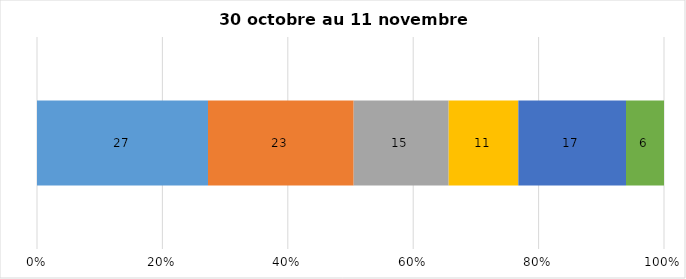
| Category | Plusieurs fois par jour | Une fois par jour | Quelques fois par semaine   | Une fois par semaine ou moins   |  Jamais   |  Je n’utilise pas les médias sociaux |
|---|---|---|---|---|---|---|
| 0 | 27 | 23 | 15 | 11 | 17 | 6 |